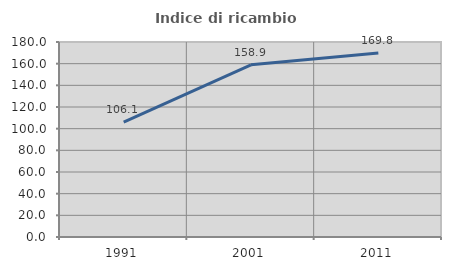
| Category | Indice di ricambio occupazionale  |
|---|---|
| 1991.0 | 106.072 |
| 2001.0 | 158.895 |
| 2011.0 | 169.828 |